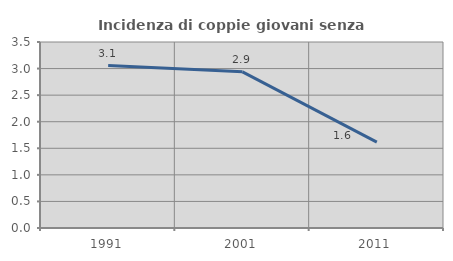
| Category | Incidenza di coppie giovani senza figli |
|---|---|
| 1991.0 | 3.056 |
| 2001.0 | 2.938 |
| 2011.0 | 1.616 |